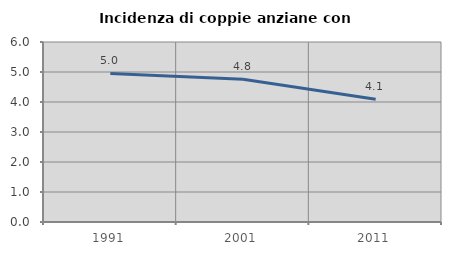
| Category | Incidenza di coppie anziane con figli |
|---|---|
| 1991.0 | 4.95 |
| 2001.0 | 4.762 |
| 2011.0 | 4.094 |